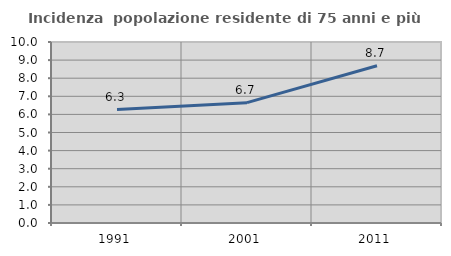
| Category | Incidenza  popolazione residente di 75 anni e più |
|---|---|
| 1991.0 | 6.27 |
| 2001.0 | 6.65 |
| 2011.0 | 8.687 |